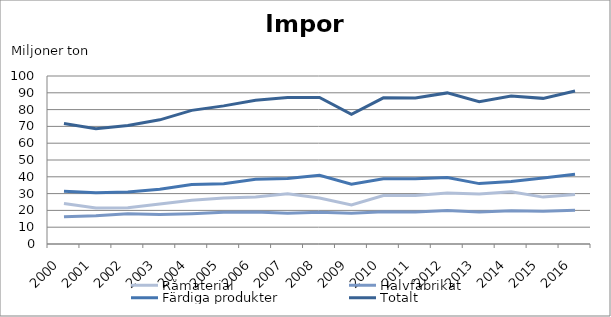
| Category | Råmaterial | Halvfabrikat | Färdiga produkter | Totalt |
|---|---|---|---|---|
| 2000.0 | 24.092 | 16.259 | 31.435 | 71.786 |
| 2001.0 | 21.458 | 16.744 | 30.44 | 68.642 |
| 2002.0 | 21.553 | 17.952 | 30.983 | 70.488 |
| 2003.0 | 23.794 | 17.523 | 32.59 | 73.906 |
| 2004.0 | 26.099 | 18.01 | 35.421 | 79.53 |
| 2005.0 | 27.44 | 18.905 | 35.877 | 82.222 |
| 2006.0 | 28.008 | 19.074 | 38.469 | 85.551 |
| 2007.0 | 29.901 | 18.267 | 38.976 | 87.144 |
| 2008.0 | 27.364 | 18.951 | 40.893 | 87.208 |
| 2009.0 | 23.233 | 18.287 | 35.626 | 77.145 |
| 2010.0 | 28.899 | 19.203 | 38.89 | 86.992 |
| 2011.0 | 28.913 | 19.112 | 38.848 | 86.873 |
| 2012.0 | 30.4 | 19.907 | 39.63 | 89.938 |
| 2013.0 | 29.709 | 19.106 | 35.945 | 84.76 |
| 2014.0 | 31.1 | 19.806 | 37.203 | 88.109 |
| 2015.0 | 27.91 | 19.502 | 39.273 | 86.686 |
| 2016.0 | 29.44 | 20.124 | 41.517 | 91.081 |